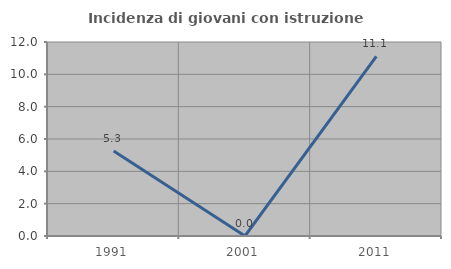
| Category | Incidenza di giovani con istruzione universitaria |
|---|---|
| 1991.0 | 5.263 |
| 2001.0 | 0 |
| 2011.0 | 11.111 |